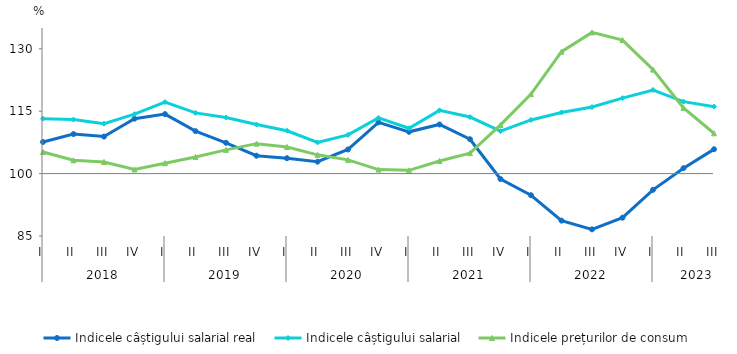
| Category | Indicele câștigului salarial real | Indicele câștigului salarial | Indicele prețurilor de consum |
|---|---|---|---|
| 0 | 107.6 | 113.2 | 105.2 |
| 1 | 109.5 | 113 | 103.2 |
| 2 | 108.9 | 112 | 102.8 |
| 3 | 113.2 | 114.3 | 101 |
| 4 | 114.3 | 117.2 | 102.5 |
| 5 | 110.2 | 114.6 | 104 |
| 6 | 107.4 | 113.5 | 105.7 |
| 7 | 104.3 | 111.8 | 107.2 |
| 8 | 103.7 | 110.3 | 106.4 |
| 9 | 102.861 | 107.5 | 104.51 |
| 10 | 105.8 | 109.3 | 103.3 |
| 11 | 112.322 | 113.4 | 100.96 |
| 12 | 110.042 | 110.9 | 100.78 |
| 13 | 111.816 | 115.2 | 103.026 |
| 14 | 108.263 | 113.6 | 104.93 |
| 15 | 98.7 | 110.2 | 111.7 |
| 16 | 94.8 | 112.9 | 119.1 |
| 17 | 88.7 | 114.7 | 129.32 |
| 18 | 86.6 | 116 | 133.938 |
| 19 | 89.4 | 118.136 | 132.1 |
| 20 | 96.1 | 120.1 | 125 |
| 21 | 101.3 | 117.3 | 115.8 |
| 22 | 105.853 | 116.1 | 109.68 |